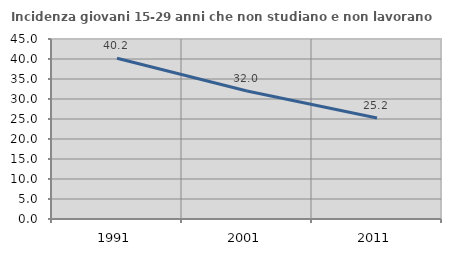
| Category | Incidenza giovani 15-29 anni che non studiano e non lavorano  |
|---|---|
| 1991.0 | 40.196 |
| 2001.0 | 31.985 |
| 2011.0 | 25.248 |